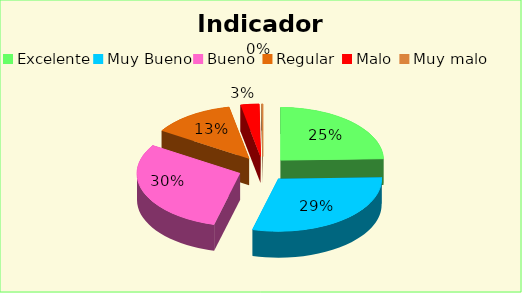
| Category | Series 0 |
|---|---|
| Excelente | 0.246 |
| Muy Bueno | 0.295 |
| Bueno  | 0.299 |
| Regular  | 0.13 |
| Malo  | 0.029 |
| Muy malo  | 0.002 |